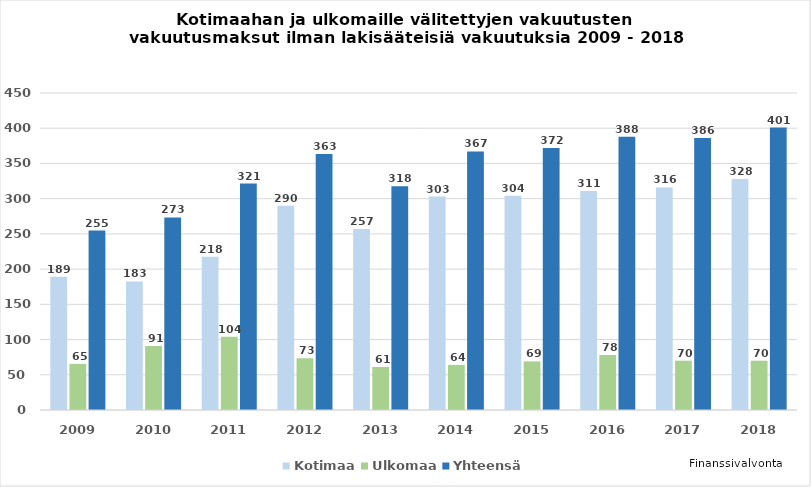
| Category | Kotimaa | Ulkomaa | Yhteensä  |
|---|---|---|---|
| 2009.0 | 189.249 | 65.417 | 254.666 |
| 2010.0 | 182.562 | 90.729 | 273.291 |
| 2011.0 | 217.55 | 103.894 | 321.444 |
| 2012.0 | 289.922 | 73.321 | 363.243 |
| 2013.0 | 257 | 61 | 317.523 |
| 2014.0 | 303 | 64 | 367 |
| 2015.0 | 304 | 69 | 372 |
| 2016.0 | 311 | 78 | 388 |
| 2017.0 | 316 | 70 | 386 |
| 2018.0 | 328 | 70 | 401 |